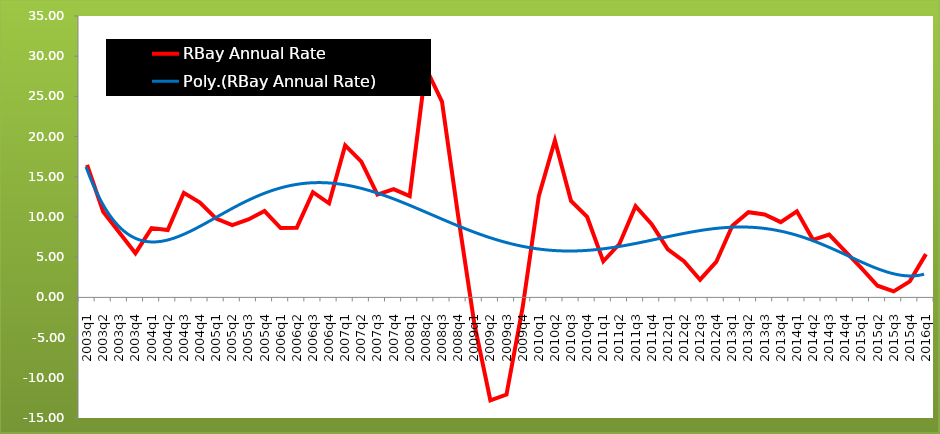
| Category | RBay Annual Rate |
|---|---|
| 2003q1 | 16.484 |
| 2003q2 | 10.653 |
| 2003q3 | 8.077 |
| 2003q4 | 5.498 |
| 2004q1 | 8.622 |
| 2004q2 | 8.384 |
| 2004q3 | 13.013 |
| 2004q4 | 11.807 |
| 2005q1 | 9.8 |
| 2005q2 | 8.977 |
| 2005q3 | 9.688 |
| 2005q4 | 10.745 |
| 2006q1 | 8.628 |
| 2006q2 | 8.672 |
| 2006q3 | 13.091 |
| 2006q4 | 11.701 |
| 2007q1 | 18.906 |
| 2007q2 | 16.896 |
| 2007q3 | 12.778 |
| 2007q4 | 13.461 |
| 2008q1 | 12.606 |
| 2008q2 | 28.539 |
| 2008q3 | 24.364 |
| 2008q4 | 10.17 |
| 2009q1 | -3.196 |
| 2009q2 | -12.796 |
| 2009q3 | -12.082 |
| 2009q4 | -1.253 |
| 2010q1 | 12.6 |
| 2010q2 | 19.508 |
| 2010q3 | 12.001 |
| 2010q4 | 10.007 |
| 2011q1 | 4.483 |
| 2011q2 | 6.641 |
| 2011q3 | 11.355 |
| 2011q4 | 9.109 |
| 2012q1 | 5.988 |
| 2012q2 | 4.496 |
| 2012q3 | 2.2 |
| 2012q4 | 4.41 |
| 2013q1 | 8.921 |
| 2013q2 | 10.603 |
| 2013q3 | 10.322 |
| 2013q4 | 9.368 |
| 2014q1 | 10.706 |
| 2014q2 | 7.16 |
| 2014q3 | 7.823 |
| 2014q4 | 5.738 |
| 2015q1 | 3.64 |
| 2015q2 | 1.448 |
| 2015q3 | 0.744 |
| 2015q4 | 1.995 |
| 2016q1 | 5.384 |